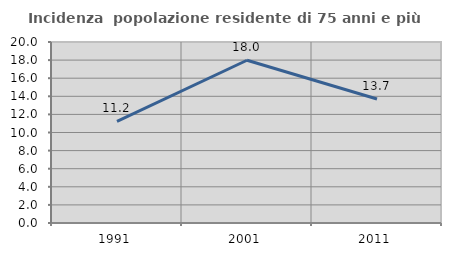
| Category | Incidenza  popolazione residente di 75 anni e più |
|---|---|
| 1991.0 | 11.235 |
| 2001.0 | 17.984 |
| 2011.0 | 13.699 |